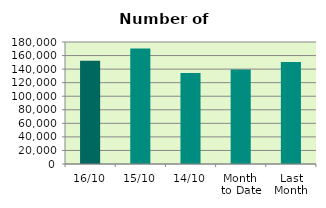
| Category | Series 0 |
|---|---|
| 16/10 | 152232 |
| 15/10 | 170576 |
| 14/10 | 134322 |
| Month 
to Date | 139374.167 |
| Last
Month | 150562.364 |